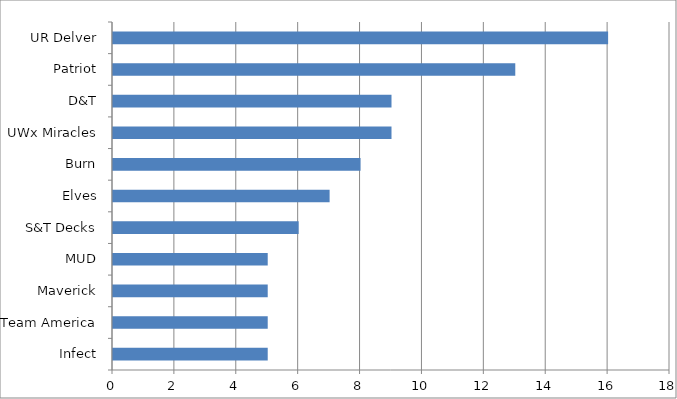
| Category | Series 0 |
|---|---|
| Infect | 5 |
| Team America | 5 |
| Maverick | 5 |
| MUD | 5 |
| S&T Decks | 6 |
| Elves | 7 |
| Burn | 8 |
| UWx Miracles | 9 |
| D&T | 9 |
| Patriot | 13 |
| UR Delver | 16 |